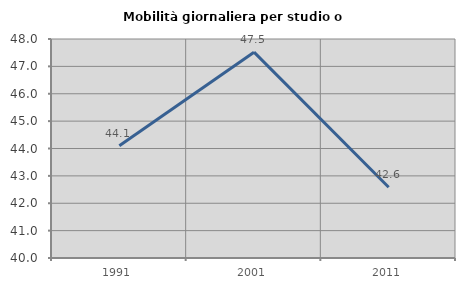
| Category | Mobilità giornaliera per studio o lavoro |
|---|---|
| 1991.0 | 44.1 |
| 2001.0 | 47.519 |
| 2011.0 | 42.583 |